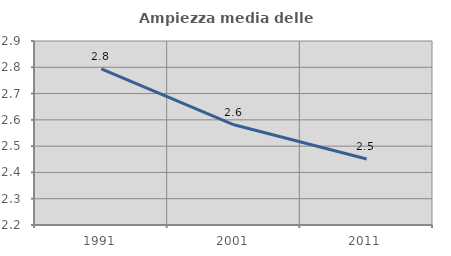
| Category | Ampiezza media delle famiglie |
|---|---|
| 1991.0 | 2.794 |
| 2001.0 | 2.581 |
| 2011.0 | 2.451 |